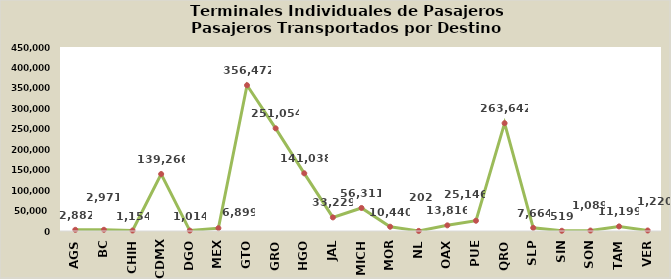
| Category | ESTADO DESTINO |
|---|---|
| AGS | 2882 |
| BC | 2971 |
| CHIH | 1154 |
| CDMX | 139266 |
| DGO | 1014 |
| MEX | 6899 |
| GTO | 356472 |
| GRO | 251054 |
| HGO | 141038 |
| JAL | 33229 |
| MICH | 56311 |
| MOR | 10440 |
| NL | 202 |
| OAX | 13816 |
| PUE | 25146 |
| QRO | 263642 |
| SLP | 7664 |
| SIN | 519 |
| SON | 1089 |
| TAM | 11199 |
| VER | 1220 |